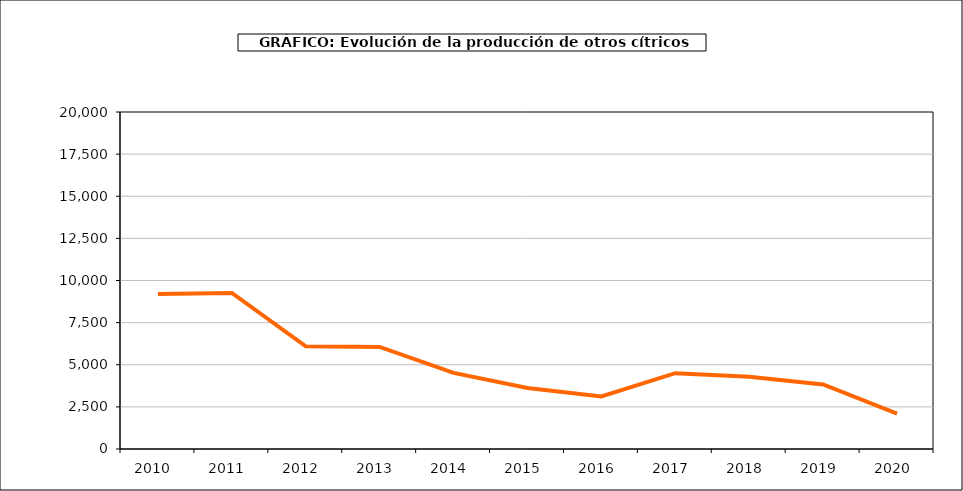
| Category | producción |
|---|---|
| 2010.0 | 9197 |
| 2011.0 | 9260 |
| 2012.0 | 6091 |
| 2013.0 | 6060 |
| 2014.0 | 4514 |
| 2015.0 | 3626 |
| 2016.0 | 3116 |
| 2017.0 | 4501 |
| 2018.0 | 4287 |
| 2019.0 | 3828 |
| 2020.0 | 2103 |